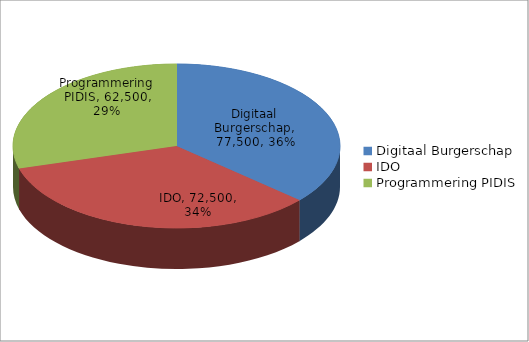
| Category | Series 0 |
|---|---|
| Digitaal Burgerschap | 77500 |
| IDO | 72500 |
| Programmering PIDIS | 62500 |